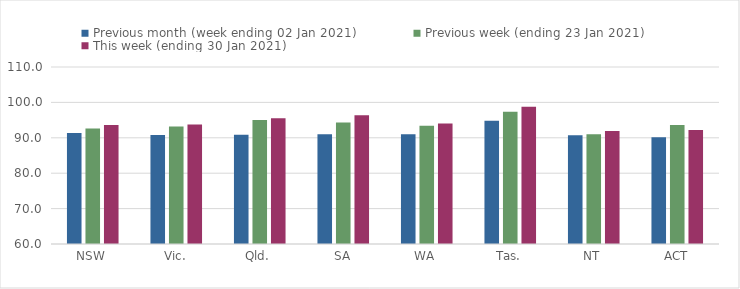
| Category | Previous month (week ending 02 Jan 2021) | Previous week (ending 23 Jan 2021) | This week (ending 30 Jan 2021) |
|---|---|---|---|
| NSW | 91.37 | 92.65 | 93.63 |
| Vic. | 90.76 | 93.16 | 93.73 |
| Qld. | 90.87 | 95.01 | 95.5 |
| SA | 90.97 | 94.33 | 96.37 |
| WA | 91.01 | 93.4 | 94.06 |
| Tas. | 94.84 | 97.33 | 98.78 |
| NT | 90.7 | 91.03 | 91.94 |
| ACT | 90.19 | 93.59 | 92.22 |